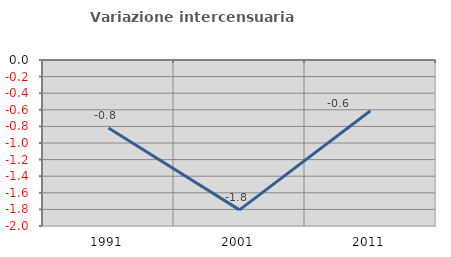
| Category | Variazione intercensuaria annua |
|---|---|
| 1991.0 | -0.818 |
| 2001.0 | -1.806 |
| 2011.0 | -0.611 |